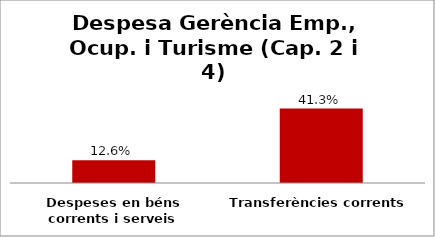
| Category | Series 0 |
|---|---|
| Despeses en béns corrents i serveis | 0.126 |
| Transferències corrents | 0.413 |